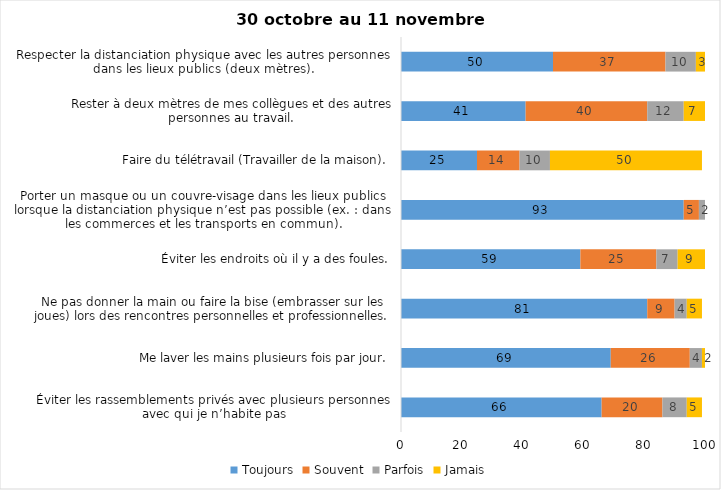
| Category | Toujours | Souvent | Parfois | Jamais |
|---|---|---|---|---|
| Éviter les rassemblements privés avec plusieurs personnes avec qui je n’habite pas | 66 | 20 | 8 | 5 |
| Me laver les mains plusieurs fois par jour. | 69 | 26 | 4 | 2 |
| Ne pas donner la main ou faire la bise (embrasser sur les joues) lors des rencontres personnelles et professionnelles. | 81 | 9 | 4 | 5 |
| Éviter les endroits où il y a des foules. | 59 | 25 | 7 | 9 |
| Porter un masque ou un couvre-visage dans les lieux publics lorsque la distanciation physique n’est pas possible (ex. : dans les commerces et les transports en commun). | 93 | 5 | 2 | 0 |
| Faire du télétravail (Travailler de la maison). | 25 | 14 | 10 | 50 |
| Rester à deux mètres de mes collègues et des autres personnes au travail. | 41 | 40 | 12 | 7 |
| Respecter la distanciation physique avec les autres personnes dans les lieux publics (deux mètres). | 50 | 37 | 10 | 3 |